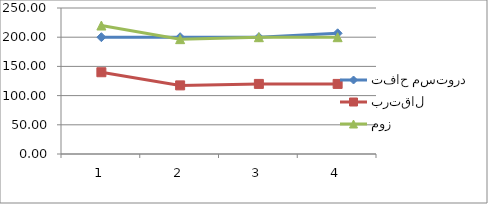
| Category | تفاح مستورد | برتقال | موز |
|---|---|---|---|
| 0 | 200 | 140 | 220 |
| 1 | 200 | 117.5 | 196.67 |
| 2 | 200 | 120 | 200 |
| 3 | 206.67 | 120 | 200 |